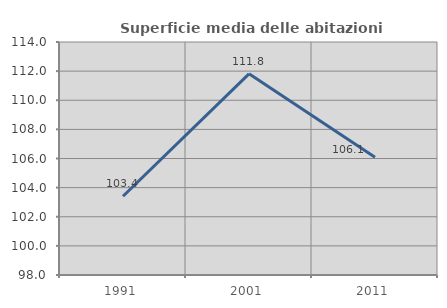
| Category | Superficie media delle abitazioni occupate |
|---|---|
| 1991.0 | 103.407 |
| 2001.0 | 111.815 |
| 2011.0 | 106.078 |